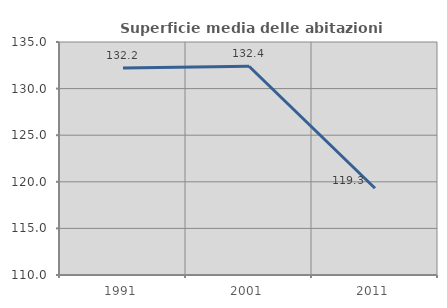
| Category | Superficie media delle abitazioni occupate |
|---|---|
| 1991.0 | 132.215 |
| 2001.0 | 132.4 |
| 2011.0 | 119.304 |